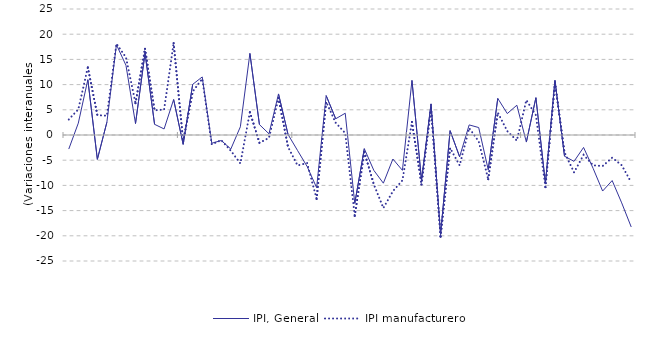
| Category | IPI, General | IPI manufacturero |
|---|---|---|
| nan | -2.79 | 3.08 |
| nan | 2.35 | 5.08 |
| nan | 10.97 | 13.42 |
| nan | -4.83 | 3.95 |
| nan | 2.54 | 3.82 |
| 2014.0 | 17.92 | 18.12 |
| nan | 13.83 | 15.4 |
| nan | 2.27 | 6.31 |
| nan | 16.24 | 17.1 |
| nan | 2.12 | 4.9 |
| nan | 1.2 | 5.04 |
| nan | 7.04 | 18.22 |
| nan | -1.86 | -1.25 |
| nan | 10.05 | 8.61 |
| nan | 11.52 | 11.17 |
| nan | -1.63 | -1.85 |
| nan | -1.09 | -1.02 |
| 2015.0 | -2.78 | -3.13 |
| nan | 1.63 | -5.64 |
| nan | 16.19 | 4.55 |
| nan | 2.07 | -1.55 |
| nan | 0.24 | -0.57 |
| nan | 8.15 | 7.32 |
| nan | 0.11 | -2.37 |
| nan | -3.08 | -6.04 |
| nan | -6.24 | -5.57 |
| nan | -10.45 | -12.69 |
| nan | 7.82 | 6.58 |
| nan | 3.22 | 2.42 |
| 2016.0 | 4.32 | 0.37 |
| nan | -13.55 | -16.06 |
| nan | -2.71 | -3.37 |
| nan | -7.02 | -9.81 |
| nan | -9.56 | -14.5 |
| nan | -4.77 | -11.14 |
| nan | -7.01 | -9 |
| nan | 10.83 | 2.58 |
| nan | -8.96 | -9.81 |
| nan | 6.17 | 5.4 |
| nan | -19.74 | -20.18 |
| nan | 0.86 | -2.58 |
| 2017.0 | -4.33 | -6.03 |
| nan | 2 | 1.38 |
| nan | 1.48 | -1.28 |
| nan | -6.89 | -8.76 |
| nan | 7.26 | 4.45 |
| nan | 4.25 | 0.77 |
| nan | 5.91 | -1.12 |
| nan | -1.4 | 6.93 |
| nan | 7.4 | 3.94 |
| nan | -9.6 | -10.35 |
| nan | 10.84 | 10.4 |
| nan | -4.21 | -3.45 |
| 2018.0 | -5.23 | -7.42 |
| nan | -2.47 | -3.94 |
| nan | -6.61 | -6.02 |
| nan | -11.12 | -6.16 |
| nan | -9.04 | -4.5 |
| nan | -13.47 | -6 |
| nan | -18.25 | -9.39 |